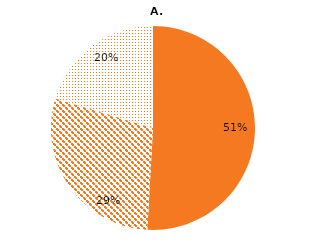
| Category | Series 0 |
|---|---|
| Unprocessed | 152000000 |
| Semi-processed | 86000000 |
| Fully-processed | 60700000 |